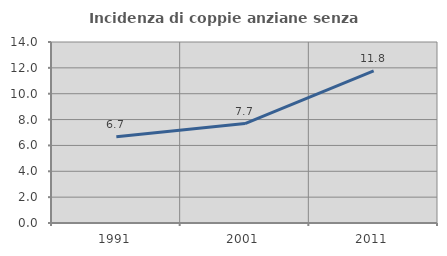
| Category | Incidenza di coppie anziane senza figli  |
|---|---|
| 1991.0 | 6.671 |
| 2001.0 | 7.692 |
| 2011.0 | 11.765 |